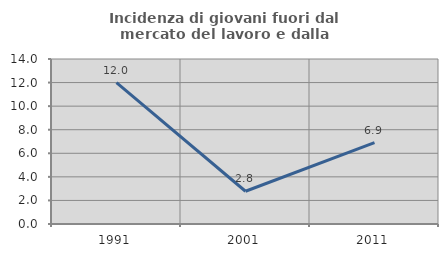
| Category | Incidenza di giovani fuori dal mercato del lavoro e dalla formazione  |
|---|---|
| 1991.0 | 12 |
| 2001.0 | 2.778 |
| 2011.0 | 6.897 |